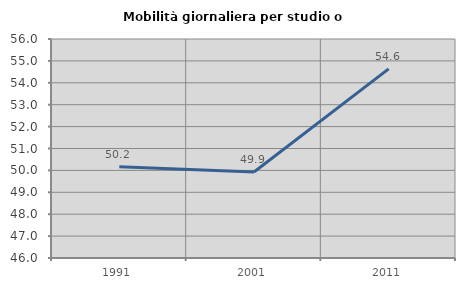
| Category | Mobilità giornaliera per studio o lavoro |
|---|---|
| 1991.0 | 50.167 |
| 2001.0 | 49.924 |
| 2011.0 | 54.635 |